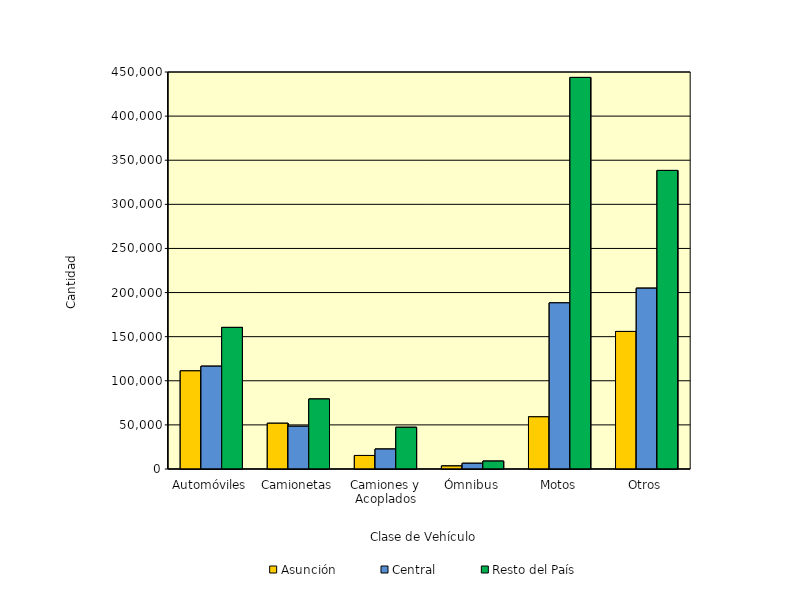
| Category | Asunción | Central | Resto del País |
|---|---|---|---|
| Automóviles | 111237 | 116510 | 160481 |
| Camionetas | 51818 | 48455 | 79316 |
| Camiones y Acoplados | 15324 | 22613 | 47288 |
| Ómnibus | 3423 | 6466 | 8938 |
| Motos | 59143 | 188306 | 443836 |
| Otros | 155903 | 204947 | 338410 |